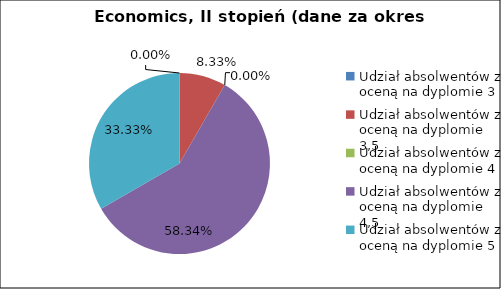
| Category | Series 0 |
|---|---|
| Udział absolwentów z oceną na dyplomie 3 | 0 |
| Udział absolwentów z oceną na dyplomie 3,5 | 8.333 |
| Udział absolwentów z oceną na dyplomie 4 | 0 |
| Udział absolwentów z oceną na dyplomie 4,5 | 58.333 |
| Udział absolwentów z oceną na dyplomie 5 | 33.333 |